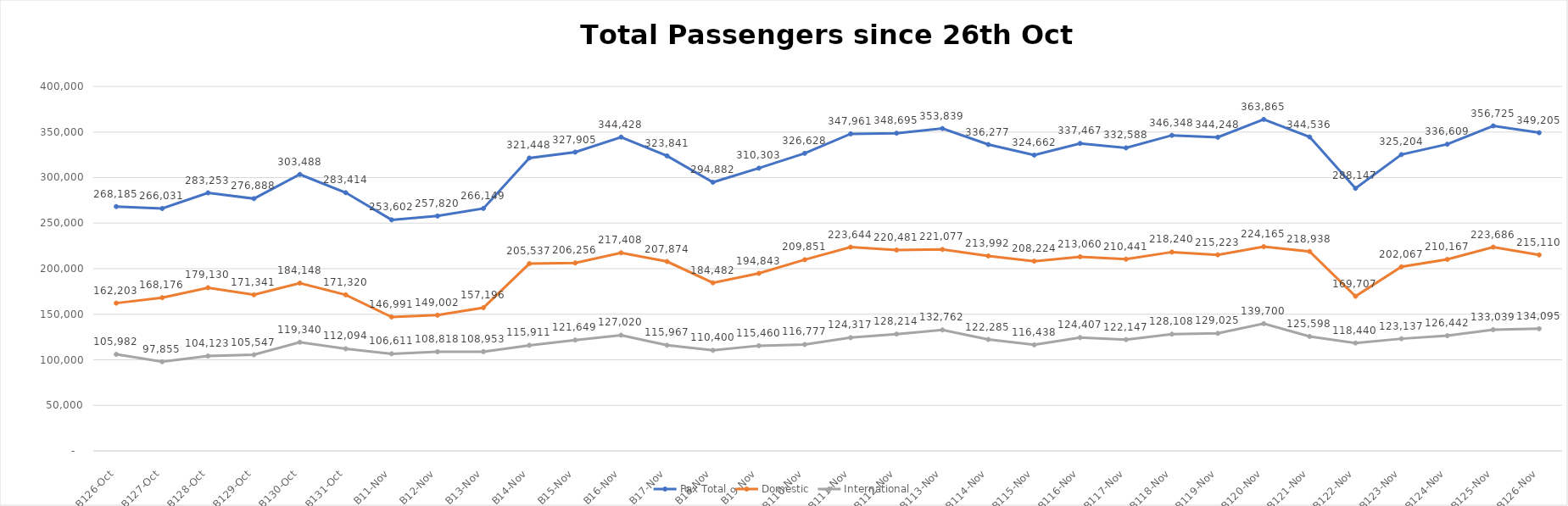
| Category | Pax Total |  Domestic  |  International  |
|---|---|---|---|
| 2022-10-26 | 268185 | 162203 | 105982 |
| 2022-10-27 | 266031 | 168176 | 97855 |
| 2022-10-28 | 283253 | 179130 | 104123 |
| 2022-10-29 | 276888 | 171341 | 105547 |
| 2022-10-30 | 303488 | 184148 | 119340 |
| 2022-10-31 | 283414 | 171320 | 112094 |
| 2022-11-01 | 253602 | 146991 | 106611 |
| 2022-11-02 | 257820 | 149002 | 108818 |
| 2022-11-03 | 266149 | 157196 | 108953 |
| 2022-11-04 | 321448 | 205537 | 115911 |
| 2022-11-05 | 327905 | 206256 | 121649 |
| 2022-11-06 | 344428 | 217408 | 127020 |
| 2022-11-07 | 323841 | 207874 | 115967 |
| 2022-11-08 | 294882 | 184482 | 110400 |
| 2022-11-09 | 310303 | 194843 | 115460 |
| 2022-11-10 | 326628 | 209851 | 116777 |
| 2022-11-11 | 347961 | 223644 | 124317 |
| 2022-11-12 | 348695 | 220481 | 128214 |
| 2022-11-13 | 353839 | 221077 | 132762 |
| 2022-11-14 | 336277 | 213992 | 122285 |
| 2022-11-15 | 324662 | 208224 | 116438 |
| 2022-11-16 | 337467 | 213060 | 124407 |
| 2022-11-17 | 332588 | 210441 | 122147 |
| 2022-11-18 | 346348 | 218240 | 128108 |
| 2022-11-19 | 344248 | 215223 | 129025 |
| 2022-11-20 | 363865 | 224165 | 139700 |
| 2022-11-21 | 344536 | 218938 | 125598 |
| 2022-11-22 | 288147 | 169707 | 118440 |
| 2022-11-23 | 325204 | 202067 | 123137 |
| 2022-11-24 | 336609 | 210167 | 126442 |
| 2022-11-25 | 356725 | 223686 | 133039 |
| 2022-11-26 | 349205 | 215110 | 134095 |